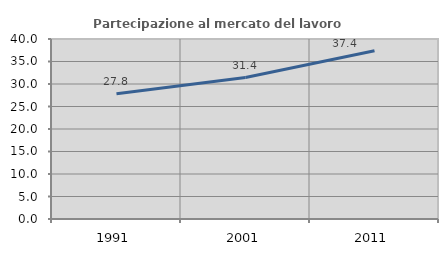
| Category | Partecipazione al mercato del lavoro  femminile |
|---|---|
| 1991.0 | 27.816 |
| 2001.0 | 31.431 |
| 2011.0 | 37.407 |